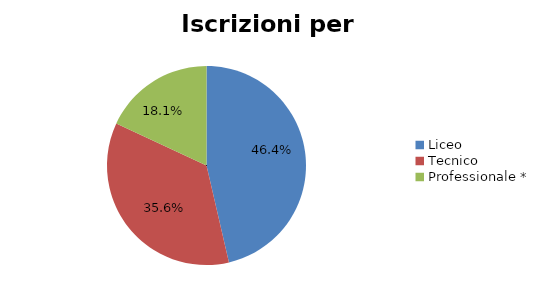
| Category | Series 0 |
|---|---|
| Liceo  | 18327 |
| Tecnico | 14052 |
| Professionale * | 7140 |